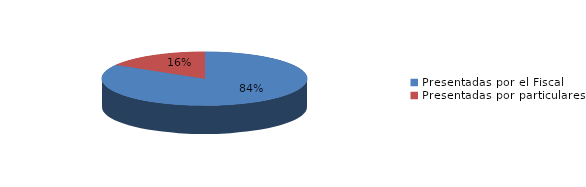
| Category | Series 0 |
|---|---|
| Presentadas por el Fiscal | 162 |
| Presentadas por particulares | 32 |